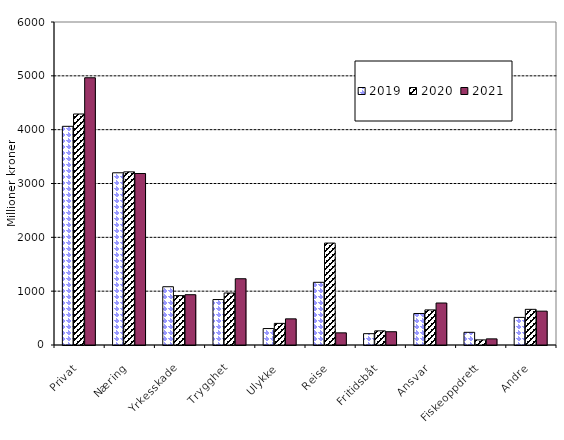
| Category | 2019 | 2020 | 2021 |
|---|---|---|---|
| Privat | 4062.098 | 4291.207 | 4964.318 |
| Næring | 3198.952 | 3215.997 | 3185.211 |
| Yrkesskade | 1082.429 | 917.481 | 934.056 |
| Trygghet | 844.528 | 966.103 | 1230.79 |
| Ulykke | 305.606 | 401.426 | 485.77 |
| Reise | 1164.677 | 1893.541 | 225.67 |
| Fritidsbåt | 210.512 | 262.931 | 246.519 |
| Ansvar | 585.276 | 651.869 | 780.018 |
| Fiskeoppdrett | 235.673 | 94.892 | 113.797 |
| Andre | 512.817 | 662.498 | 628.909 |